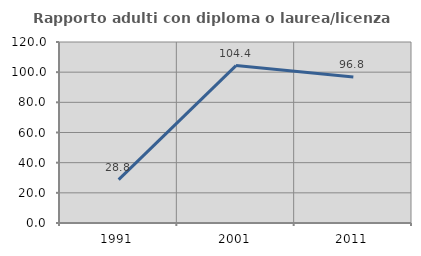
| Category | Rapporto adulti con diploma o laurea/licenza media  |
|---|---|
| 1991.0 | 28.758 |
| 2001.0 | 104.386 |
| 2011.0 | 96.774 |